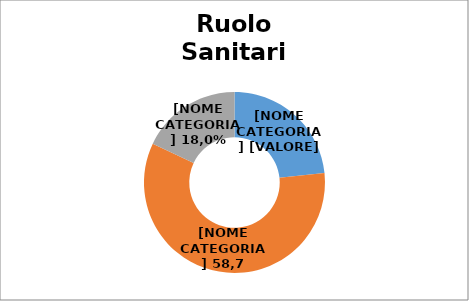
| Category | Series 0 |
|---|---|
| Medici e Odontoiatri | 0.233 |
| Infermieristico | 0.587 |
| Altro  | 0.179 |